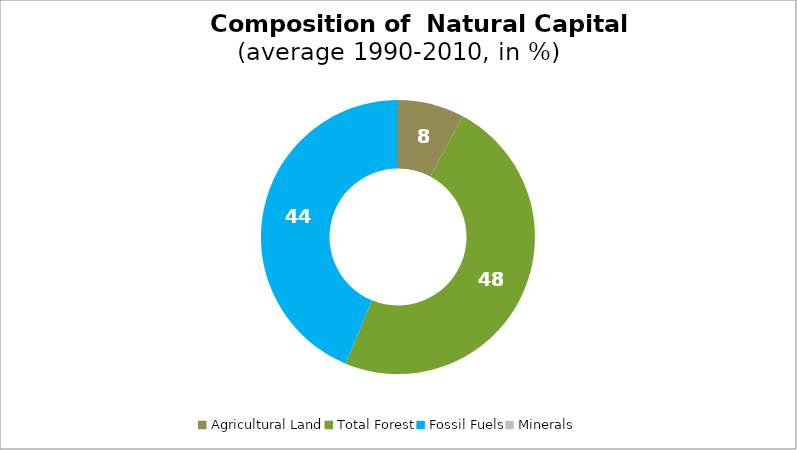
| Category | Series 0 |
|---|---|
| Agricultural Land | 7.826 |
| Total Forest | 48.405 |
| Fossil Fuels | 43.769 |
| Minerals | 0 |